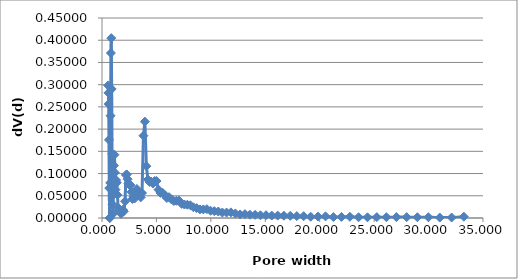
| Category | Series 0 |
|---|---|
| 0.567 | 0.298 |
| 0.59 | 0.282 |
| 0.614 | 0.256 |
| 0.64 | 0.176 |
| 0.666 | 0.067 |
| 0.694 | 0 |
| 0.723 | 0 |
| 0.753 | 0.079 |
| 0.785 | 0.23 |
| 0.818 | 0.371 |
| 0.852 | 0.405 |
| 0.889 | 0.29 |
| 0.926 | 0.144 |
| 0.966 | 0.031 |
| 1.007 | 0.009 |
| 1.051 | 0.053 |
| 1.096 | 0.118 |
| 1.144 | 0.142 |
| 1.193 | 0.102 |
| 1.245 | 0.064 |
| 1.299 | 0.085 |
| 1.356 | 0.08 |
| 1.416 | 0.052 |
| 1.478 | 0.022 |
| 1.543 | 0.016 |
| 1.611 | 0.02 |
| 1.682 | 0.012 |
| 1.756 | 0.01 |
| 1.834 | 0.015 |
| 1.915 | 0.019 |
| 2.0 | 0.015 |
| 2.1206 | 0.038 |
| 2.1948 | 0.097 |
| 2.2717 | 0.098 |
| 2.3512 | 0.087 |
| 2.4335 | 0.077 |
| 2.5186 | 0.074 |
| 2.6068 | 0.074 |
| 2.698 | 0.058 |
| 2.7925 | 0.043 |
| 2.8902 | 0.047 |
| 2.9914 | 0.044 |
| 3.0961 | 0.059 |
| 3.2044 | 0.065 |
| 3.3166 | 0.058 |
| 3.4326 | 0.056 |
| 3.5528 | 0.046 |
| 3.6771 | 0.056 |
| 3.8058 | 0.185 |
| 3.939 | 0.217 |
| 4.0769 | 0.117 |
| 4.2196 | 0.086 |
| 4.3673 | 0.081 |
| 4.5201 | 0.082 |
| 4.6784 | 0.077 |
| 4.8421 | 0.083 |
| 5.0116 | 0.083 |
| 5.187 | 0.064 |
| 5.369 | 0.056 |
| 5.556 | 0.057 |
| 5.751 | 0.052 |
| 5.952 | 0.045 |
| 6.16 | 0.047 |
| 6.376 | 0.042 |
| 6.599 | 0.038 |
| 6.83 | 0.039 |
| 7.069 | 0.039 |
| 7.317 | 0.032 |
| 7.573 | 0.03 |
| 7.8379 | 0.03 |
| 8.1122 | 0.029 |
| 8.3961 | 0.024 |
| 8.69 | 0.022 |
| 8.9941 | 0.019 |
| 9.3089 | 0.019 |
| 9.6347 | 0.02 |
| 9.972 | 0.016 |
| 10.321 | 0.015 |
| 10.682 | 0.015 |
| 11.056 | 0.012 |
| 11.443 | 0.012 |
| 11.8436 | 0.013 |
| 12.2581 | 0.01 |
| 12.6871 | 0.008 |
| 13.1312 | 0.009 |
| 13.5908 | 0.007 |
| 14.0664 | 0.007 |
| 14.5588 | 0.006 |
| 15.0683 | 0.006 |
| 15.5957 | 0.005 |
| 16.1416 | 0.005 |
| 16.7065 | 0.005 |
| 17.2912 | 0.005 |
| 17.8964 | 0.004 |
| 18.5228 | 0.004 |
| 19.1711 | 0.003 |
| 19.8421 | 0.003 |
| 20.5366 | 0.004 |
| 21.2553 | 0.002 |
| 21.9993 | 0.002 |
| 22.7693 | 0.003 |
| 23.5662 | 0.002 |
| 24.391 | 0.002 |
| 25.2447 | 0.002 |
| 26.1282 | 0.002 |
| 27.0427 | 0.002 |
| 27.9892 | 0.002 |
| 28.9689 | 0.002 |
| 29.9828 | 0.002 |
| 31.0322 | 0.001 |
| 32.1183 | 0.001 |
| 33.2424 | 0.003 |